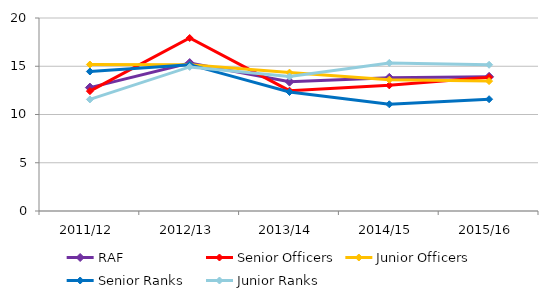
| Category | RAF | Senior Officers | Junior Officers | Senior Ranks | Junior Ranks |
|---|---|---|---|---|---|
| 2011/12 | 12.789 | 12.42 | 15.18 | 14.456 | 11.562 |
| 2012/13 | 15.329 | 17.927 | 15.164 | 15.166 | 14.933 |
| 2013/14 | 13.401 | 12.468 | 14.341 | 12.331 | 13.929 |
| 2014/15 | 13.796 | 13.022 | 13.606 | 11.059 | 15.346 |
| 2015/16 | 13.903 | 13.863 | 13.46 | 11.584 | 15.151 |